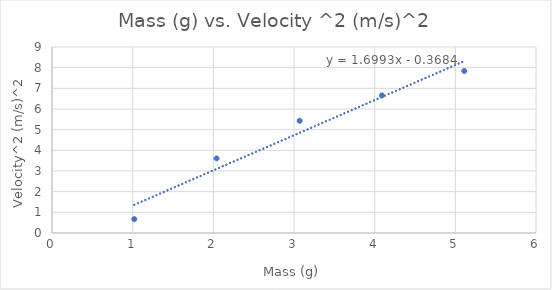
| Category | Series 0 |
|---|---|
| 1.02 | 0.672 |
| 2.04 | 3.61 |
| 3.07 | 5.429 |
| 4.09 | 6.656 |
| 5.11 | 7.84 |